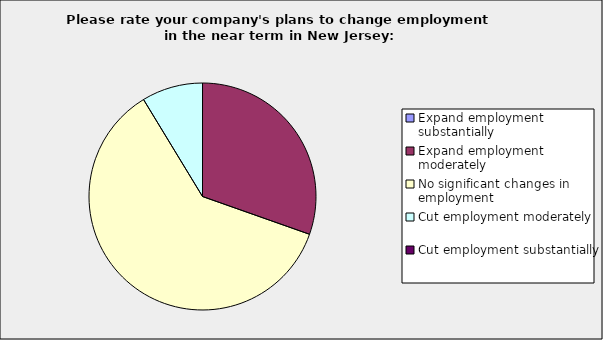
| Category | Series 0 |
|---|---|
| Expand employment substantially | 0 |
| Expand employment moderately | 0.304 |
| No significant changes in employment | 0.609 |
| Cut employment moderately | 0.087 |
| Cut employment substantially | 0 |